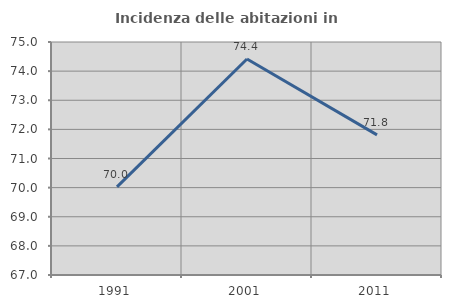
| Category | Incidenza delle abitazioni in proprietà  |
|---|---|
| 1991.0 | 70.024 |
| 2001.0 | 74.414 |
| 2011.0 | 71.812 |